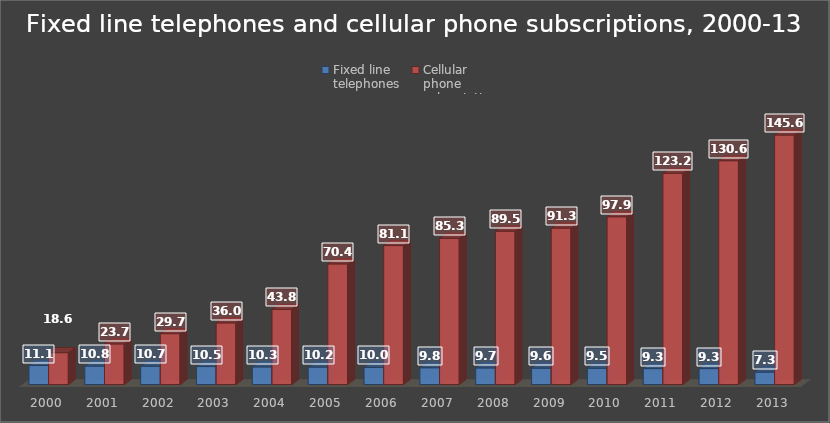
| Category | Fixed line 
telephones | Cellular 
phone
subscriptions |
|---|---|---|
| 2000.0 | 11.1 | 18.6 |
| 2001.0 | 10.8 | 23.7 |
| 2002.0 | 10.7 | 29.7 |
| 2003.0 | 10.5 | 36 |
| 2004.0 | 10.3 | 43.8 |
| 2005.0 | 10.2 | 70.4 |
| 2006.0 | 10 | 81.1 |
| 2007.0 | 9.8 | 85.3 |
| 2008.0 | 9.7 | 89.5 |
| 2009.0 | 9.6 | 91.3 |
| 2010.0 | 9.5 | 97.9 |
| 2011.0 | 9.3 | 123.2 |
| 2012.0 | 9.3 | 130.6 |
| 2013.0 | 7.3 | 145.6 |